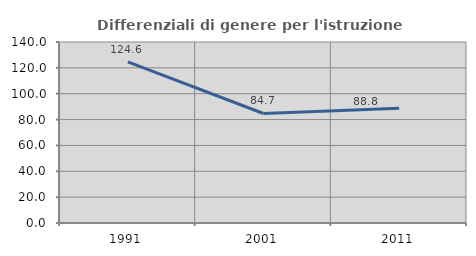
| Category | Differenziali di genere per l'istruzione superiore |
|---|---|
| 1991.0 | 124.61 |
| 2001.0 | 84.702 |
| 2011.0 | 88.759 |